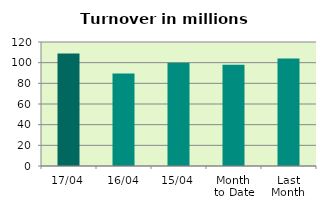
| Category | Series 0 |
|---|---|
| 17/04 | 108.769 |
| 16/04 | 89.462 |
| 15/04 | 99.9 |
| Month 
to Date | 97.884 |
| Last
Month | 104.085 |